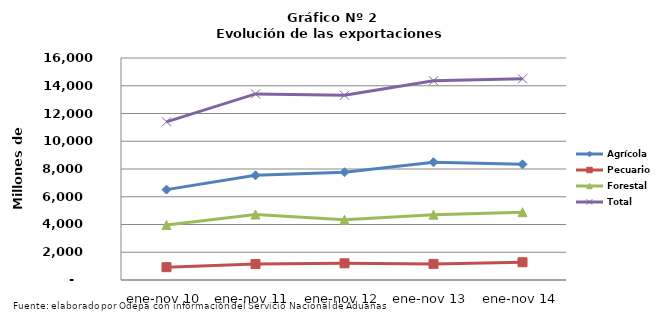
| Category | Agrícola | Pecuario | Forestal | Total |
|---|---|---|---|---|
| ene-nov 10 | 6513683 | 924376 | 3961949 | 11400008 |
| ene-nov 11 | 7544196 | 1148342 | 4718665 | 13411203 |
| ene-nov 12 | 7766874 | 1202710 | 4346682 | 13316266 |
| ene-nov 13 | 8486984 | 1161617 | 4711344 | 14359945 |
| ene-nov 14 | 8335395 | 1278317 | 4885901 | 14499613 |